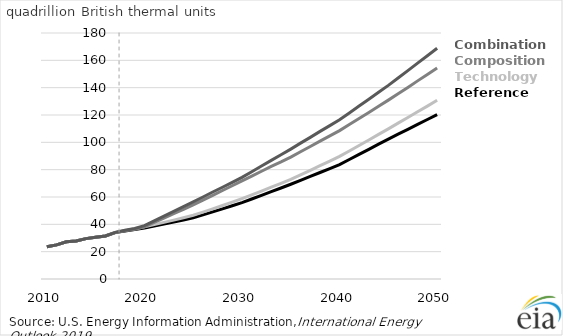
| Category | #REF! | tech-india | macro-India | combo-India |
|---|---|---|---|---|
| 2010.0 | 23.571 | 23.571 | 23.571 | 23.571 |
| 2011.0 | 24.95 | 24.95 | 24.95 | 24.95 |
| 2012.0 | 27.29 | 27.29 | 27.29 | 27.29 |
| 2013.0 | 27.801 | 27.801 | 27.801 | 27.801 |
| 2014.0 | 29.532 | 29.532 | 29.532 | 29.532 |
| 2015.0 | 30.538 | 30.538 | 30.538 | 30.538 |
| 2016.0 | 31.458 | 31.458 | 31.458 | 31.458 |
| 2017.0 | 33.932 | 34.118 | 33.936 | 34.121 |
| 2018.0 | 35.176 | 35.57 | 35.279 | 35.673 |
| 2019.0 | 36.163 | 36.744 | 36.367 | 36.949 |
| 2020.0 | 37.362 | 38.143 | 38.245 | 39.047 |
| 2021.0 | 38.803 | 39.779 | 41.483 | 42.567 |
| 2022.0 | 40.214 | 41.418 | 44.619 | 45.976 |
| 2023.0 | 41.676 | 43.057 | 47.779 | 49.411 |
| 2024.0 | 43.217 | 44.802 | 51.018 | 52.921 |
| 2025.0 | 44.856 | 46.639 | 54.257 | 56.457 |
| 2026.0 | 46.909 | 48.934 | 57.704 | 59.998 |
| 2027.0 | 49.098 | 51.348 | 61.237 | 63.65 |
| 2028.0 | 51.319 | 53.778 | 64.754 | 67.127 |
| 2029.0 | 53.581 | 56.293 | 68.219 | 70.752 |
| 2030.0 | 55.882 | 58.858 | 71.744 | 74.33 |
| 2031.0 | 58.525 | 61.596 | 75.3 | 78.526 |
| 2032.0 | 61.182 | 64.37 | 78.838 | 82.641 |
| 2033.0 | 63.881 | 67.207 | 82.355 | 86.829 |
| 2034.0 | 66.573 | 70.001 | 85.638 | 90.907 |
| 2035.0 | 69.332 | 72.93 | 89.138 | 95.064 |
| 2036.0 | 72.2 | 76.249 | 93.078 | 99.4 |
| 2037.0 | 75.05 | 79.549 | 96.982 | 103.64 |
| 2038.0 | 77.936 | 82.948 | 100.901 | 108.003 |
| 2039.0 | 80.781 | 86.324 | 104.709 | 112.243 |
| 2040.0 | 83.718 | 89.699 | 108.599 | 116.567 |
| 2041.0 | 87.438 | 93.699 | 113.012 | 121.521 |
| 2042.0 | 91.185 | 97.697 | 117.478 | 126.525 |
| 2043.0 | 94.892 | 101.744 | 121.877 | 131.476 |
| 2044.0 | 98.647 | 105.853 | 126.342 | 136.58 |
| 2045.0 | 102.339 | 109.882 | 130.876 | 141.651 |
| 2046.0 | 105.977 | 114.074 | 135.516 | 147.061 |
| 2047.0 | 109.493 | 118.128 | 140.197 | 152.51 |
| 2048.0 | 113.113 | 122.319 | 144.968 | 157.99 |
| 2049.0 | 116.711 | 126.516 | 149.712 | 163.339 |
| 2050.0 | 120.258 | 130.774 | 154.364 | 168.877 |